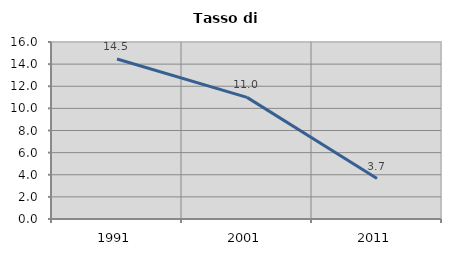
| Category | Tasso di disoccupazione   |
|---|---|
| 1991.0 | 14.465 |
| 2001.0 | 10.995 |
| 2011.0 | 3.659 |